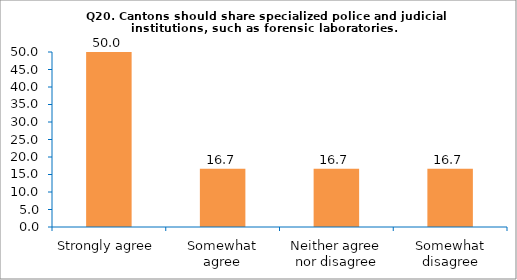
| Category | Series 0 |
|---|---|
| Strongly agree | 50 |
| Somewhat agree | 16.667 |
| Neither agree nor disagree | 16.667 |
| Somewhat disagree | 16.667 |